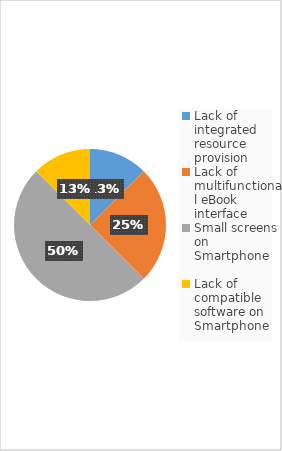
| Category | Series 0 |
|---|---|
| Lack of integrated resource provision | 1 |
| Lack of multifunctional eBook interface | 2 |
| Small screens on Smartphone | 4 |
| Lack of compatible software on Smartphone | 1 |